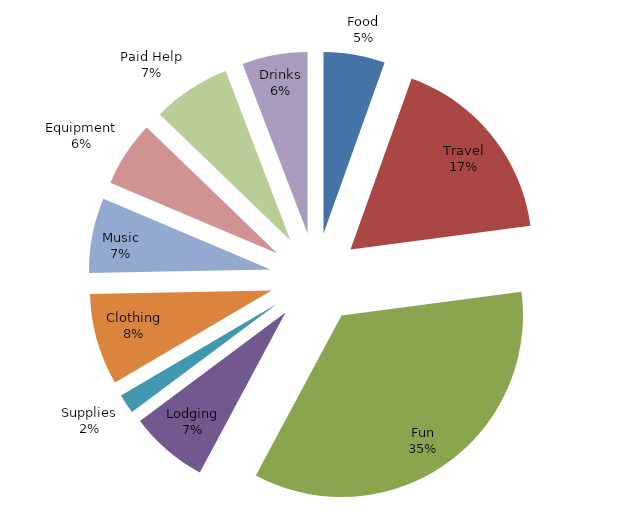
| Category | Series 0 |
|---|---|
| Food | 470 |
| Travel | 1500 |
| Fun | 3000 |
| Lodging | 600 |
| Supplies | 150 |
| Clothing | 700 |
| Music | 575 |
| Equipment | 500 |
| Paid Help | 600 |
| Drinks | 500 |